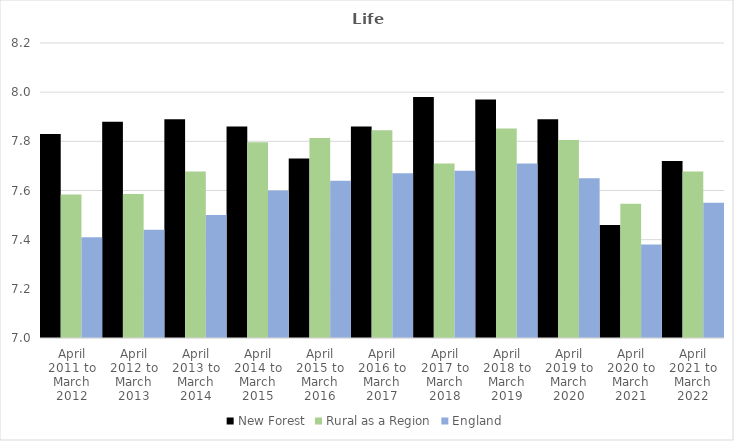
| Category | New Forest | Rural as a Region | England |
|---|---|---|---|
| April 2011 to March 2012 | 7.83 | 7.584 | 7.41 |
| April 2012 to March 2013 | 7.88 | 7.586 | 7.44 |
| April 2013 to March 2014 | 7.89 | 7.677 | 7.5 |
| April 2014 to March 2015 | 7.86 | 7.797 | 7.6 |
| April 2015 to March 2016 | 7.73 | 7.813 | 7.64 |
| April 2016 to March 2017 | 7.86 | 7.845 | 7.67 |
| April 2017 to March 2018 | 7.98 | 7.71 | 7.68 |
| April 2018 to March 2019 | 7.97 | 7.852 | 7.71 |
| April 2019 to March 2020 | 7.89 | 7.806 | 7.65 |
| April 2020 to March 2021 | 7.46 | 7.546 | 7.38 |
| April 2021 to March 2022 | 7.72 | 7.677 | 7.55 |